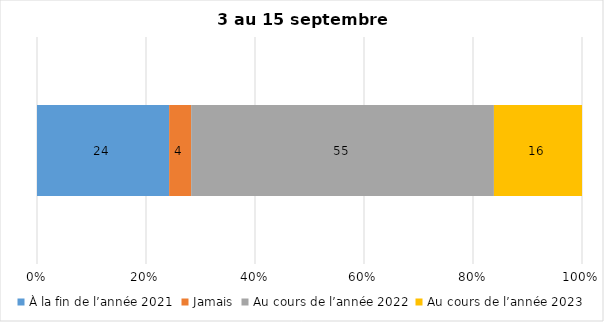
| Category | À la fin de l’année 2021 | Jamais | Au cours de l’année 2022 | Au cours de l’année 2023 |
|---|---|---|---|---|
| 0 | 24 | 4 | 55 | 16 |